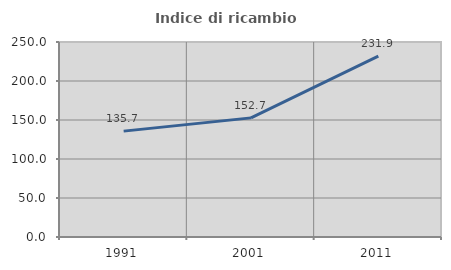
| Category | Indice di ricambio occupazionale  |
|---|---|
| 1991.0 | 135.738 |
| 2001.0 | 152.722 |
| 2011.0 | 231.865 |